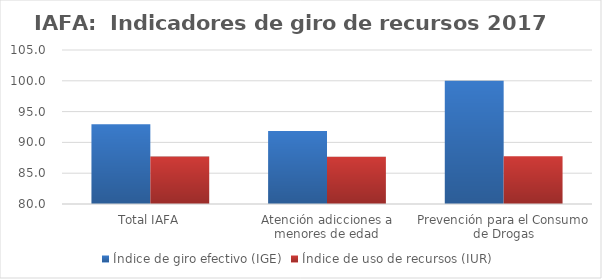
| Category | Índice de giro efectivo (IGE) | Índice de uso de recursos (IUR)  |
|---|---|---|
| Total IAFA | 92.93 | 87.693 |
| Atención adicciones a menores de edad | 91.839 | 87.683 |
| Prevención para el Consumo de Drogas | 99.998 | 87.749 |